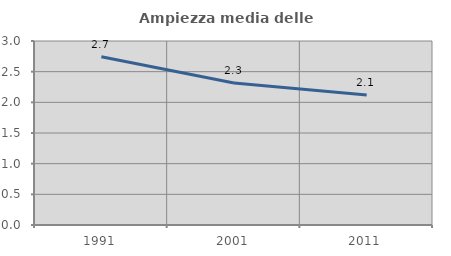
| Category | Ampiezza media delle famiglie |
|---|---|
| 1991.0 | 2.742 |
| 2001.0 | 2.316 |
| 2011.0 | 2.121 |